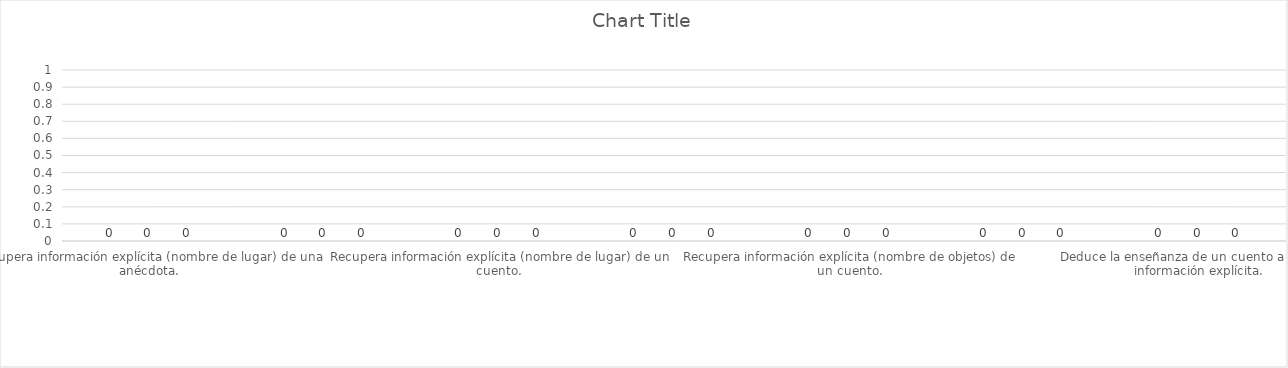
| Category | ADECUADAS | INADECUADAS | OMITIDAS |
|---|---|---|---|
| Recupera información explícita (nombre de lugar) de una anécdota. | 0 | 0 | 0 |
| Recupera información explícita (menciona hechos) de una anécdota. | 0 | 0 | 0 |
| Recupera información explícita (nombre de lugar) de un cuento. | 0 | 0 | 0 |
| Recupera información explícita (nombre de personajes) de un cuento.  | 0 | 0 | 0 |
| Recupera información explícita (nombre de objetos) de un cuento. | 0 | 0 | 0 |
| Recupera información explícita (nombre de lugar) de un cuento. | 0 | 0 | 0 |
| Deduce la enseñanza de un cuento a partir de información explícita. | 0 | 0 | 0 |